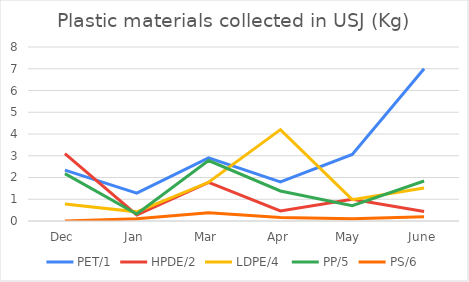
| Category | PET/1 | HPDE/2 | LDPE/4  | PP/5 | PS/6 |
|---|---|---|---|---|---|
| Dec | 2.34 | 3.1 | 0.78 | 2.18 | 0 |
| Jan | 1.28 | 0.28 | 0.42 | 0.32 | 0.1 |
| Mar | 2.9 | 1.78 | 1.78 | 2.78 | 0.38 |
| Apr | 1.8 | 0.46 | 4.2 | 1.38 | 0.16 |
| May  | 3.06 | 1 | 0.98 | 0.7 | 0.1 |
| June | 7 | 0.44 | 1.52 | 1.84 | 0.2 |